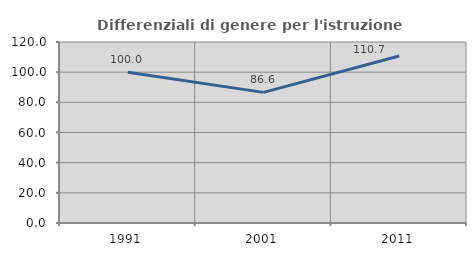
| Category | Differenziali di genere per l'istruzione superiore |
|---|---|
| 1991.0 | 99.993 |
| 2001.0 | 86.612 |
| 2011.0 | 110.687 |